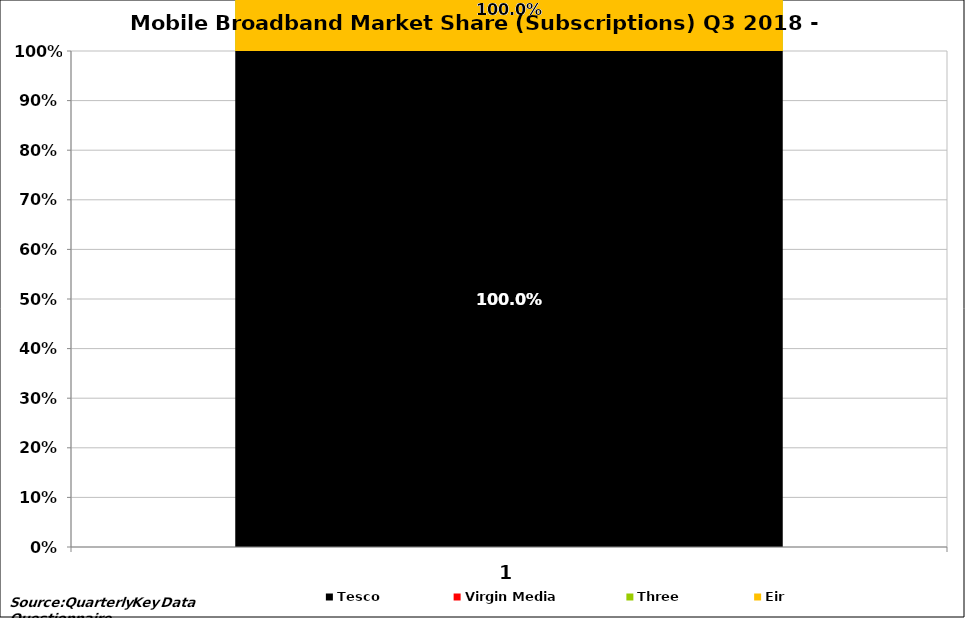
| Category | Tesco | Virgin Media | Three | Eir |
|---|---|---|---|---|
| 0 | 1 | 1 | 1 | 1 |